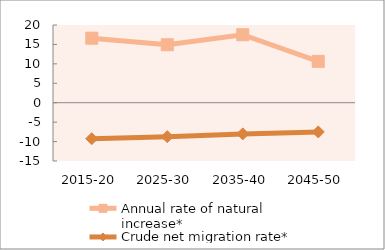
| Category | Annual rate of natural increase* | Crude net migration rate* |
|---|---|---|
| 2015-20 | 16.605 | -9.262 |
| 2025-30 | 14.919 | -8.739 |
| 2035-40 | 17.492 | -8.022 |
| 2045-50 | 10.639 | -7.518 |